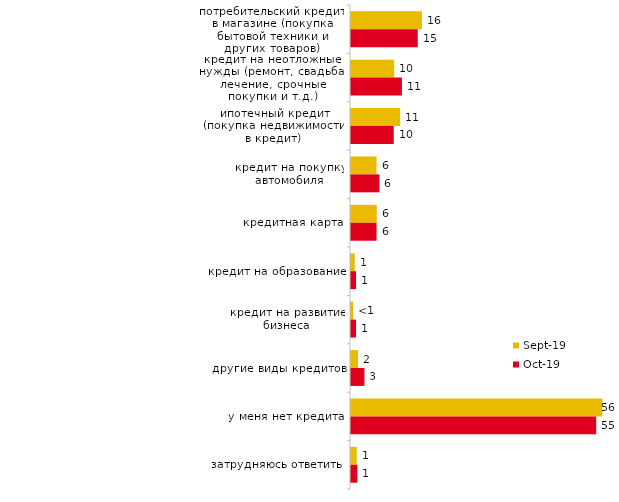
| Category | сен.19 | окт.19 |
|---|---|---|
| потребительский кредит в магазине (покупка бытовой техники и других товаров) | 15.941 | 15 |
| кредит на неотложные нужды (ремонт, свадьба, лечение, срочные покупки и т.д.) | 9.703 | 11.436 |
| ипотечный кредит (покупка недвижимости в кредит) | 11.04 | 9.604 |
| кредит на покупку автомобиля | 5.743 | 6.386 |
| кредитная карта | 5.792 | 5.743 |
| кредит на образование | 0.842 | 1.139 |
| кредит на развитие бизнеса | 0.495 | 1.139 |
| другие виды кредитов | 1.584 | 3.02 |
| у меня нет кредита | 56.485 | 55.099 |
| затрудняюсь ответить | 1.287 | 1.436 |